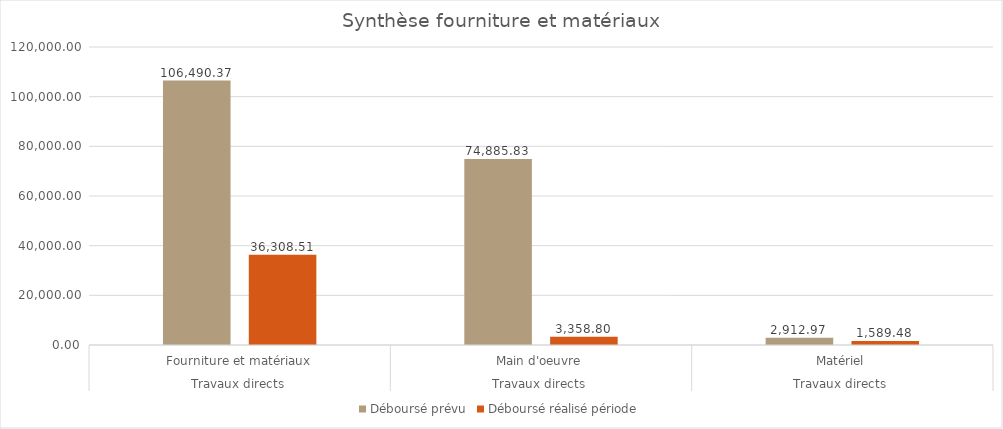
| Category | Déboursé prévu | Déboursé réalisé période |
|---|---|---|
| 0 | 106490.37 | 36308.513 |
| 1 | 74885.83 | 3358.8 |
| 2 | 2912.97 | 1589.48 |